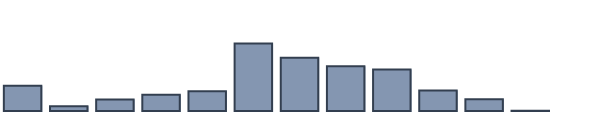
| Category | Series 0 |
|---|---|
| 0 | 8 |
| 1 | 1.5 |
| 2 | 3.6 |
| 3 | 5.1 |
| 4 | 6.2 |
| 5 | 21.3 |
| 6 | 16.8 |
| 7 | 14.1 |
| 8 | 13.1 |
| 9 | 6.5 |
| 10 | 3.7 |
| 11 | 0.1 |
| 12 | 0 |